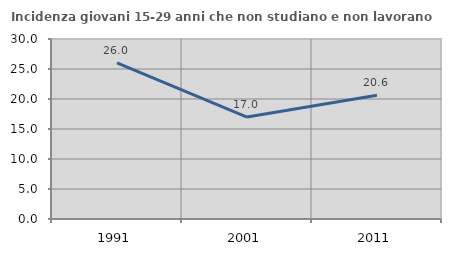
| Category | Incidenza giovani 15-29 anni che non studiano e non lavorano  |
|---|---|
| 1991.0 | 26.02 |
| 2001.0 | 16.991 |
| 2011.0 | 20.632 |